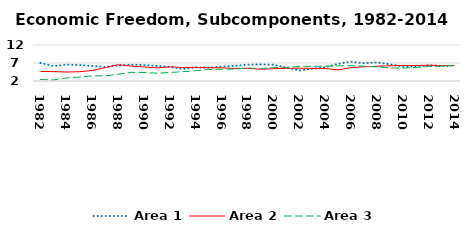
| Category | Area 1 | Area 2 | Area 3 |
|---|---|---|---|
| 1982.0 | 6.975 | 4.647 | 2.416 |
| 1983.0 | 6.172 | 4.609 | 2.293 |
| 1984.0 | 6.542 | 4.483 | 2.848 |
| 1985.0 | 6.446 | 4.58 | 3.102 |
| 1986.0 | 6.16 | 4.909 | 3.426 |
| 1987.0 | 5.903 | 5.713 | 3.419 |
| 1988.0 | 6.359 | 6.52 | 3.858 |
| 1989.0 | 6.525 | 6.139 | 4.41 |
| 1990.0 | 6.43 | 5.903 | 4.364 |
| 1991.0 | 6.195 | 5.646 | 4.171 |
| 1992.0 | 5.914 | 5.925 | 4.367 |
| 1993.0 | 5.342 | 5.75 | 4.596 |
| 1994.0 | 5.775 | 5.799 | 4.855 |
| 1995.0 | 5.693 | 5.676 | 5.21 |
| 1996.0 | 6.011 | 5.678 | 5.267 |
| 1997.0 | 6.233 | 5.457 | 5.343 |
| 1998.0 | 6.517 | 5.534 | 5.614 |
| 1999.0 | 6.612 | 5.263 | 5.458 |
| 2000.0 | 6.514 | 5.424 | 5.736 |
| 2001.0 | 5.711 | 5.518 | 5.805 |
| 2002.0 | 4.909 | 5.571 | 6.058 |
| 2003.0 | 5.381 | 5.494 | 6.076 |
| 2004.0 | 5.852 | 5.48 | 6.087 |
| 2005.0 | 6.772 | 5.079 | 6.211 |
| 2006.0 | 7.337 | 5.734 | 6.259 |
| 2007.0 | 6.964 | 5.942 | 6.126 |
| 2008.0 | 7.151 | 6.085 | 5.898 |
| 2009.0 | 6.644 | 6.24 | 5.616 |
| 2010.0 | 6.007 | 6.332 | 5.588 |
| 2011.0 | 5.967 | 6.303 | 5.766 |
| 2012.0 | 6.376 | 6.383 | 6.016 |
| 2013.0 | 6.196 | 6.29 | 6.128 |
| 2014.0 | 6.252 | 6.291 | 6.357 |